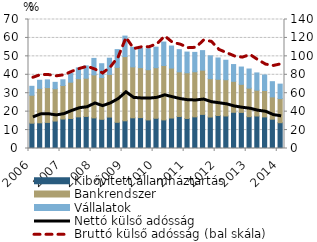
| Category | Kibővített államháztartás | Bankrendszer | Vállalatok |
|---|---|---|---|
| 2006.0 | 13.745 | 15.157 | 4.849 |
| 2006.0 | 13.936 | 18.704 | 4.394 |
| 2006.0 | 14.156 | 18.88 | 4.212 |
| 2006.0 | 14.897 | 17.536 | 3.468 |
| 2007.0 | 15.99 | 18.18 | 3.119 |
| 2007.0 | 16.288 | 19.692 | 4.758 |
| 2007.0 | 17.163 | 20.727 | 5.844 |
| 2007.0 | 17.396 | 20.751 | 6.677 |
| 2008.0 | 16.612 | 23.328 | 8.945 |
| 2008.0 | 15.838 | 22.643 | 7.521 |
| 2008.0 | 17.053 | 23.168 | 8.775 |
| 2008.0 | 14.219 | 29.803 | 9.643 |
| 2009.0 | 15.029 | 34.836 | 11.129 |
| 2009.0 | 16.654 | 27.639 | 10.619 |
| 2009.0 | 16.759 | 27.099 | 10.466 |
| 2009.0 | 15.512 | 27.244 | 11.391 |
| 2010.0 | 16.403 | 27.449 | 11.138 |
| 2010.0 | 15.515 | 29.508 | 12.741 |
| 2010.0 | 16.546 | 27.11 | 11.942 |
| 2010.0 | 17.372 | 24.231 | 12.035 |
| 2011.0 | 16.307 | 24.773 | 11.252 |
| 2011.0 | 17.178 | 24.454 | 10.528 |
| 2011.0 | 18.507 | 24.004 | 10.598 |
| 2011.0 | 17.076 | 20.796 | 12.424 |
| 2012.0 | 17.89 | 19.669 | 11.562 |
| 2012.0 | 17.646 | 19.683 | 10.559 |
| 2012.0 | 19.671 | 16.785 | 9.098 |
| 2012.0 | 19.581 | 15.23 | 9.392 |
| 2013.0 | 17.256 | 15.505 | 10.372 |
| 2013.0 | 17.627 | 14.014 | 9.368 |
| 2013.0 | 17.151 | 14.322 | 8.417 |
| 2013.0 | 15.896 | 12.103 | 8.256 |
| 2014.0 | 13.996 | 13.102 | 7.829 |